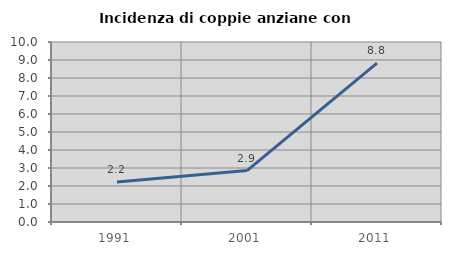
| Category | Incidenza di coppie anziane con figli |
|---|---|
| 1991.0 | 2.222 |
| 2001.0 | 2.857 |
| 2011.0 | 8.824 |